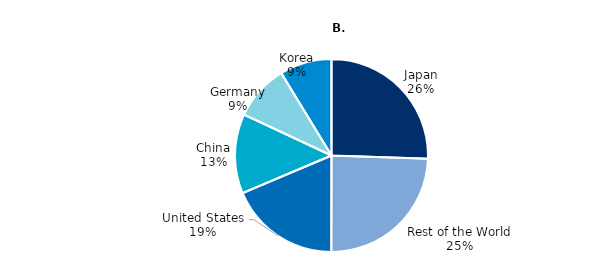
| Category | 2017-2019 |
|---|---|
| Japan | 195.44 |
| Rest of the World | 187.623 |
| United States | 142.48 |
| China | 101.946 |
| Germany | 71.505 |
| Korea | 66.728 |